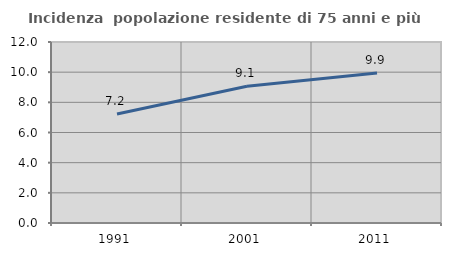
| Category | Incidenza  popolazione residente di 75 anni e più |
|---|---|
| 1991.0 | 7.227 |
| 2001.0 | 9.067 |
| 2011.0 | 9.94 |